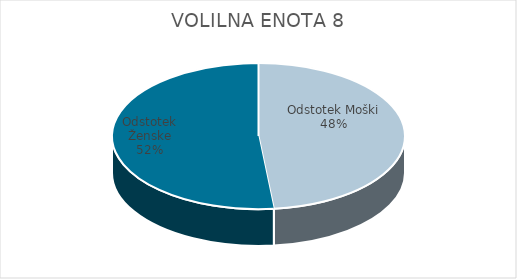
| Category | VOLILNA ENOTA 8 | #REF! | Slovenija skupaj |
|---|---|---|---|
| Odstotek Moški | 17.98 |  | 21.63 |
| Odstotek Ženske | 19.22 |  | 24.53 |